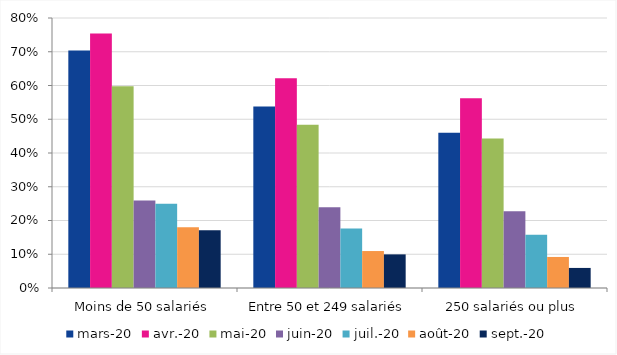
| Category | mars-20 | avr.-20 | mai-20 | juin-20 | juil.-20 | août-20 | sept.-20 |
|---|---|---|---|---|---|---|---|
| Moins de 50 salariés | 0.704 | 0.754 | 0.598 | 0.259 | 0.249 | 0.18 | 0.171 |
| Entre 50 et 249 salariés | 0.538 | 0.622 | 0.484 | 0.239 | 0.176 | 0.11 | 0.1 |
| 250 salariés ou plus | 0.46 | 0.562 | 0.443 | 0.227 | 0.158 | 0.092 | 0.059 |